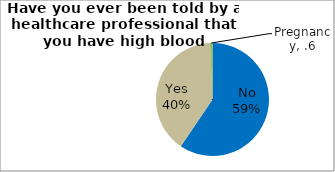
| Category | Series 0 |
|---|---|
| No | 59.462 |
| Yes | 39.838 |
| Pregnancy | 0.701 |